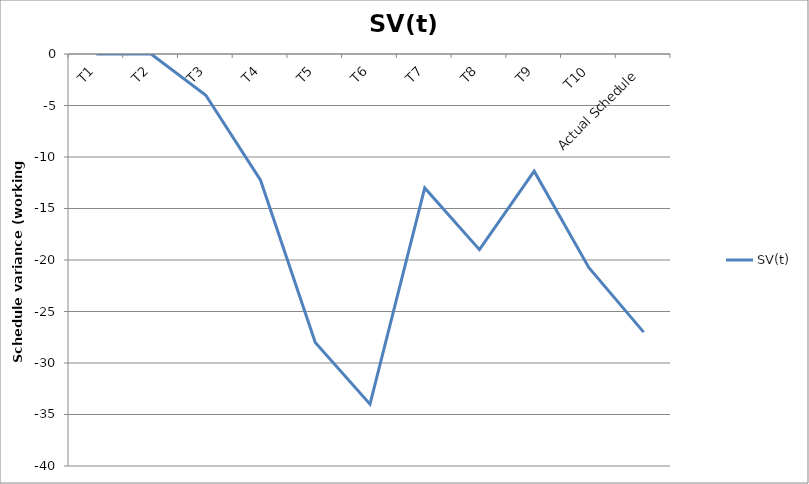
| Category | SV(t) |
|---|---|
| T1 | 0 |
| T2 | 0 |
| T3 | -4 |
| T4 | -12.25 |
| T5 | -28 |
| T6 | -34 |
| T7 | -13 |
| T8 | -19 |
| T9 | -11.375 |
| T10 | -20.75 |
| Actual Schedule | -27 |